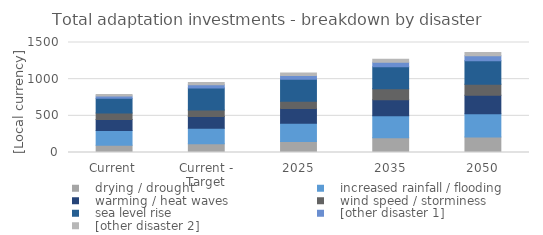
| Category |    drying / drought |    increased rainfall / flooding |    warming / heat waves |    wind speed / storminess |    sea level rise |    [other disaster 1] |    [other disaster 2] |
|---|---|---|---|---|---|---|---|
| Current | 100 | 200 | 150 | 90 | 200 | 30 | 20 |
| Current - Target | 120 | 210 | 160 | 90 | 300 | 45 | 30 |
| 2025 | 150 | 250 | 200 | 100 | 300 | 50 | 35 |
| 2035 | 200 | 300 | 220 | 150 | 300 | 60 | 40 |
| 2050 | 210 | 320 | 250 | 150 | 320 | 70 | 45 |